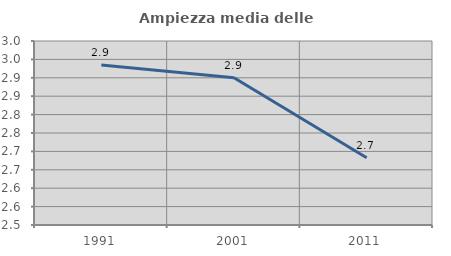
| Category | Ampiezza media delle famiglie |
|---|---|
| 1991.0 | 2.935 |
| 2001.0 | 2.9 |
| 2011.0 | 2.683 |